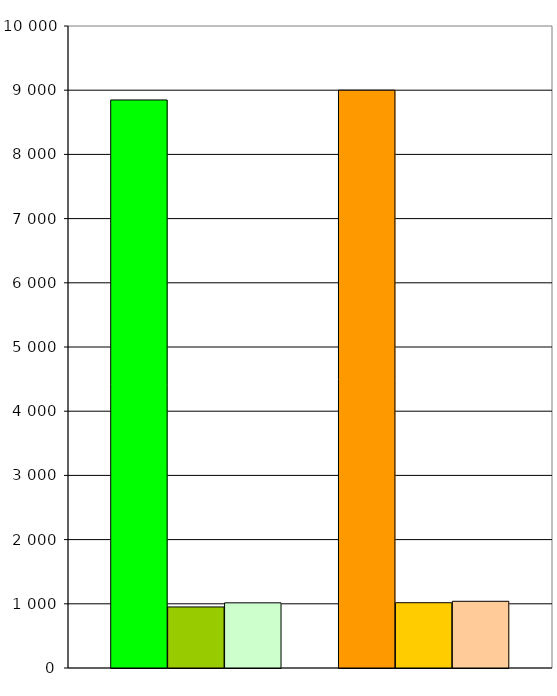
| Category | Series 0 | Series 1 | Series 2 | Series 3 | Series 4 | Series 5 | Series 6 |
|---|---|---|---|---|---|---|---|
| 0 | 8848 | 951 | 1015 |  | 9000 | 1017 | 1039 |